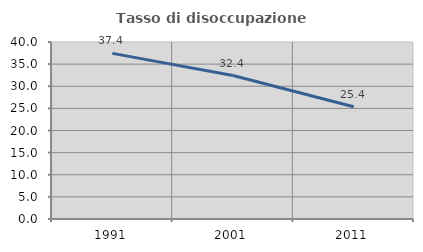
| Category | Tasso di disoccupazione giovanile  |
|---|---|
| 1991.0 | 37.429 |
| 2001.0 | 32.423 |
| 2011.0 | 25.373 |